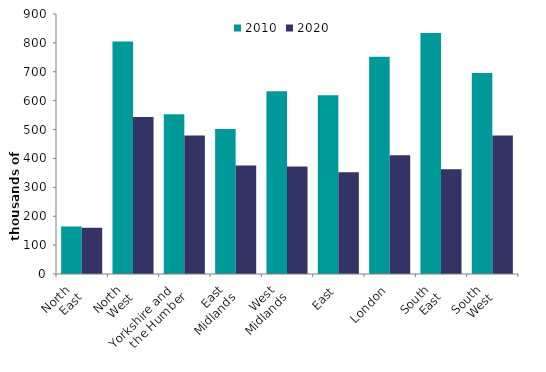
| Category | 2010 | 2020 |
|---|---|---|
| North 
East | 164.088 | 159.911 |
| North 
West | 804.83 | 543.782 |
| Yorkshire and 
the Humber | 552.743 | 479.779 |
| East 
Midlands | 501.797 | 375.784 |
| West 
Midlands | 632.916 | 371.745 |
| East | 618.34 | 352.457 |
| London | 752.432 | 410.99 |
| South 
East | 834.468 | 362.857 |
| South 
West | 695.775 | 479.389 |